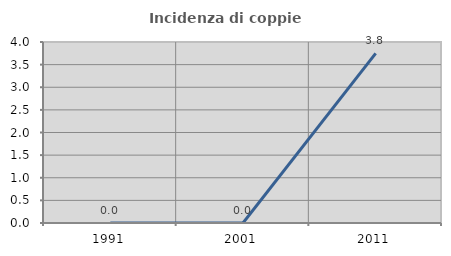
| Category | Incidenza di coppie miste |
|---|---|
| 1991.0 | 0 |
| 2001.0 | 0 |
| 2011.0 | 3.75 |